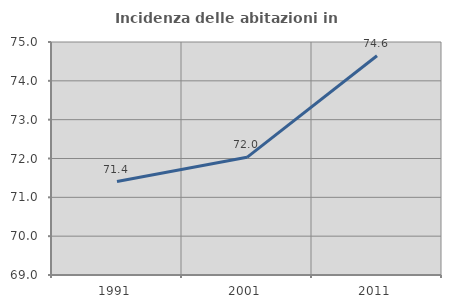
| Category | Incidenza delle abitazioni in proprietà  |
|---|---|
| 1991.0 | 71.407 |
| 2001.0 | 72.03 |
| 2011.0 | 74.645 |